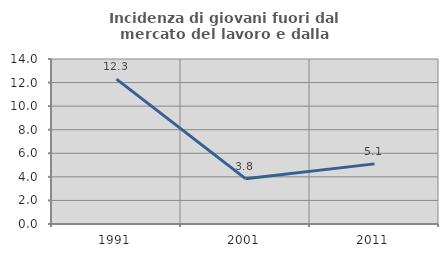
| Category | Incidenza di giovani fuori dal mercato del lavoro e dalla formazione  |
|---|---|
| 1991.0 | 12.291 |
| 2001.0 | 3.846 |
| 2011.0 | 5.102 |